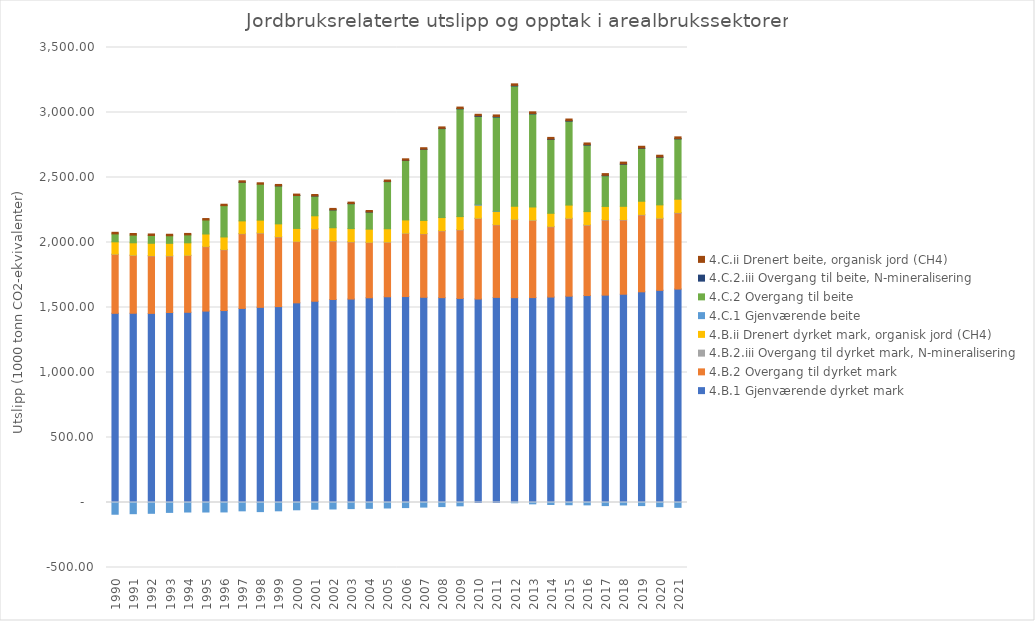
| Category | 4.B.1 Gjenværende dyrket mark | 4.B.2 Overgang til dyrket mark | 4.B.2.iii Overgang til dyrket mark, N-mineralisering | 4.B.ii Drenert dyrket mark, organisk jord (CH4) | 4.C.1 Gjenværende beite | 4.C.2 Overgang til beite | 4.C.2.iii Overgang til beite, N-mineralisering | 4.C.ii Drenert beite, organisk jord (CH4) |
|---|---|---|---|---|---|---|---|---|
| 1990.0 | 1455.242 | 453.063 | 2.83 | 94.162 | -90.309 | 60.994 | 0 | 12.251 |
| 1991.0 | 1455.716 | 444.942 | 2.743 | 94.397 | -86.116 | 59.205 | 0 | 12.022 |
| 1992.0 | 1454.779 | 442.095 | 2.661 | 94.631 | -83.13 | 59.698 | 0 | 11.793 |
| 1993.0 | 1461.634 | 434.581 | 2.576 | 94.866 | -76.102 | 58.172 | 0 | 11.565 |
| 1994.0 | 1463.106 | 436.865 | 2.491 | 95.1 | -73.129 | 60.887 | 0 | 11.336 |
| 1995.0 | 1472.314 | 495.514 | 2.435 | 95.335 | -73.188 | 107.607 | 0 | 11.108 |
| 1996.0 | 1476.509 | 467.883 | 2.377 | 95.839 | -72.634 | 240.884 | 0 | 10.879 |
| 1997.0 | 1492.963 | 574.421 | 2.388 | 96.544 | -64.047 | 297.283 | 0.199 | 10.879 |
| 1998.0 | 1501.293 | 571.208 | 2.401 | 97.25 | -70.118 | 276.317 | 0 | 10.879 |
| 1999.0 | 1507.028 | 535.972 | 2.409 | 97.955 | -63.887 | 292.2 | 0.077 | 10.879 |
| 2000.0 | 1535.839 | 471.232 | 2.404 | 98.661 | -56.067 | 252.87 | 0.617 | 10.879 |
| 2001.0 | 1547.973 | 555.641 | 2.464 | 99.366 | -51.759 | 151.82 | 0.898 | 10.879 |
| 2002.0 | 1561.8 | 449.713 | 2.454 | 99.66 | -49.925 | 136.693 | 1.002 | 10.879 |
| 2003.0 | 1564.808 | 439.674 | 2.441 | 99.954 | -47.01 | 191.547 | 1.203 | 10.879 |
| 2004.0 | 1574.706 | 425.035 | 2.396 | 100.542 | -44.819 | 131.358 | 1.354 | 10.879 |
| 2005.0 | 1582.513 | 419.74 | 2.34 | 101.13 | -42.181 | 362.525 | 1.518 | 10.879 |
| 2006.0 | 1584.317 | 486.198 | 2.287 | 100.836 | -39.154 | 457.545 | 1.709 | 10.879 |
| 2007.0 | 1578.522 | 488.456 | 2.263 | 100.542 | -35.298 | 546.284 | 1.945 | 11.071 |
| 2008.0 | 1575.769 | 513.646 | 2.3 | 100.248 | -31.473 | 683.822 | 2.176 | 11.263 |
| 2009.0 | 1569.907 | 527.419 | 2.372 | 99.749 | -25.663 | 828.36 | 2.541 | 11.455 |
| 2010.0 | 1565.261 | 619.887 | 2.568 | 99.249 | 7.326 | 675.355 | 4.985 | 11.647 |
| 2011.0 | 1577.751 | 558.262 | 2.806 | 99.543 | 2.903 | 723.375 | 4.701 | 11.935 |
| 2012.0 | 1575.74 | 600.678 | 3.029 | 99.749 | -2.065 | 924.7 | 4.388 | 12.127 |
| 2013.0 | 1576.153 | 593.851 | 3.23 | 99.954 | -10.413 | 715.787 | 3.824 | 12.319 |
| 2014.0 | 1580.332 | 540.637 | 3.395 | 100.366 | -15.333 | 567.512 | 3.538 | 12.671 |
| 2015.0 | 1587.11 | 596.547 | 3.562 | 100.778 | -17.412 | 645.4 | 3.487 | 13.023 |
| 2016.0 | 1591.913 | 541.297 | 3.705 | 100.983 | -18.313 | 511.011 | 3.442 | 13.279 |
| 2017.0 | 1595.011 | 577.45 | 3.808 | 101.16 | -23.804 | 236.006 | 3.053 | 13.439 |
| 2018.0 | 1602.134 | 570.983 | 3.919 | 101.336 | -18.829 | 322.975 | 3.45 | 13.599 |
| 2019.0 | 1620.637 | 591.281 | 4.052 | 101.41 | -23.827 | 406.17 | 3.093 | 13.679 |
| 2020.0 | 1631.885 | 551.927 | 4.187 | 101.483 | -32.094 | 365.576 | 2.472 | 13.759 |
| 2021.0 | 1641.789 | 585.284 | 4.264 | 101.66 | -37.311 | 463.539 | 2.123 | 13.887 |